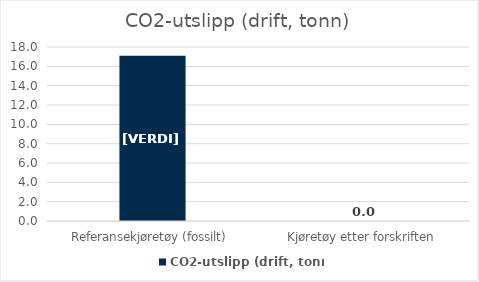
| Category | CO2-utslipp (drift, tonn) |
|---|---|
| Referansekjøretøy (fossilt) | 17.093 |
| Kjøretøy etter forskriften | 0 |